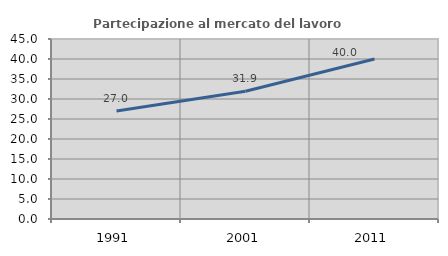
| Category | Partecipazione al mercato del lavoro  femminile |
|---|---|
| 1991.0 | 26.99 |
| 2001.0 | 31.944 |
| 2011.0 | 40 |